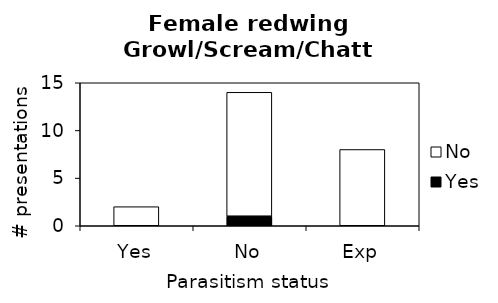
| Category | Yes | No |
|---|---|---|
| Yes | 0 | 2 |
| No | 1 | 13 |
| Exp | 0 | 8 |